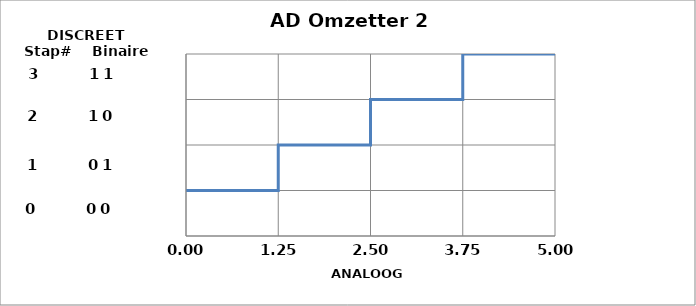
| Category | Discreet |
|---|---|
| 0.0 | 1.25 |
| 1.25 | 1.25 |
| 1.25 | 2.5 |
| 2.5 | 2.5 |
| 2.5 | 3.75 |
| 3.75 | 3.75 |
| 3.75 | 5 |
| 5.0 | 5 |